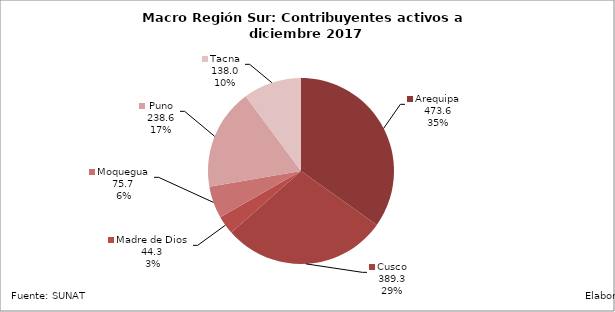
| Category | Contribuyentes |
|---|---|
| Arequipa | 473.634 |
| Cusco | 389.278 |
| Madre de Dios | 44.258 |
| Moquegua | 75.742 |
| Puno | 238.586 |
| Tacna | 137.96 |